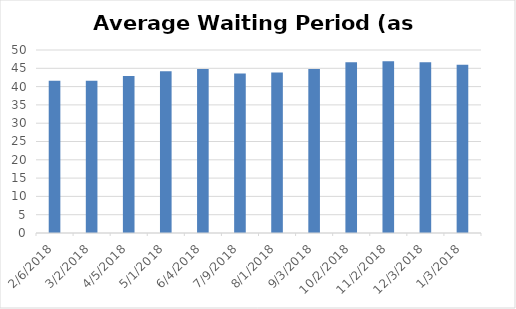
| Category | Series 0 |
|---|---|
| 2/6/2018 | 41.61 |
| 3/2/2018 | 41.59 |
| 4/5/2018 | 42.89 |
| 5/1/2018 | 44.18 |
| 6/4/2018 | 44.78 |
| 7/9/2018 | 43.56 |
| 8/1/2018 | 43.88 |
| 9/3/2018 | 44.78 |
| 10/2/2018 | 46.68 |
| 11/2/2018 | 46.9 |
| 12/3/2018 | 46.65 |
| 1/3/2018 | 45.96 |